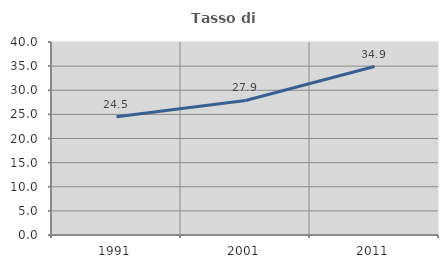
| Category | Tasso di occupazione   |
|---|---|
| 1991.0 | 24.502 |
| 2001.0 | 27.876 |
| 2011.0 | 34.922 |